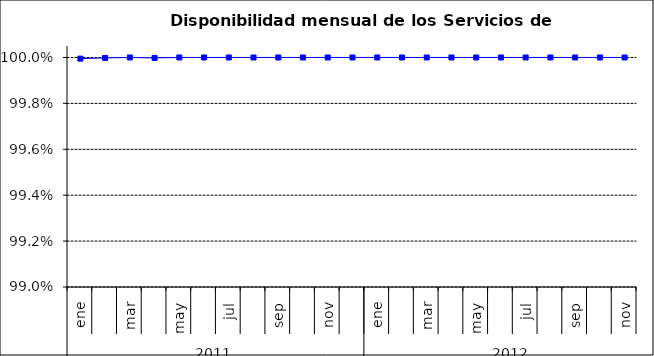
| Category | SCL |
|---|---|
| 0 | 1 |
| 1 | 1 |
| 2 | 1 |
| 3 | 1 |
| 4 | 1 |
| 5 | 1 |
| 6 | 1 |
| 7 | 1 |
| 8 | 1 |
| 9 | 1 |
| 10 | 1 |
| 11 | 1 |
| 12 | 1 |
| 13 | 1 |
| 14 | 1 |
| 15 | 1 |
| 16 | 1 |
| 17 | 1 |
| 18 | 1 |
| 19 | 1 |
| 20 | 1 |
| 21 | 1 |
| 22 | 1 |